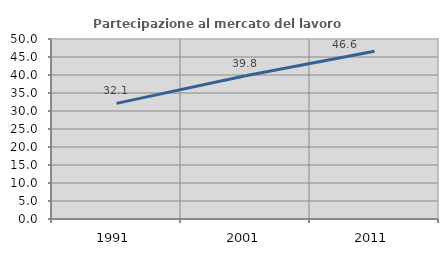
| Category | Partecipazione al mercato del lavoro  femminile |
|---|---|
| 1991.0 | 32.12 |
| 2001.0 | 39.791 |
| 2011.0 | 46.601 |